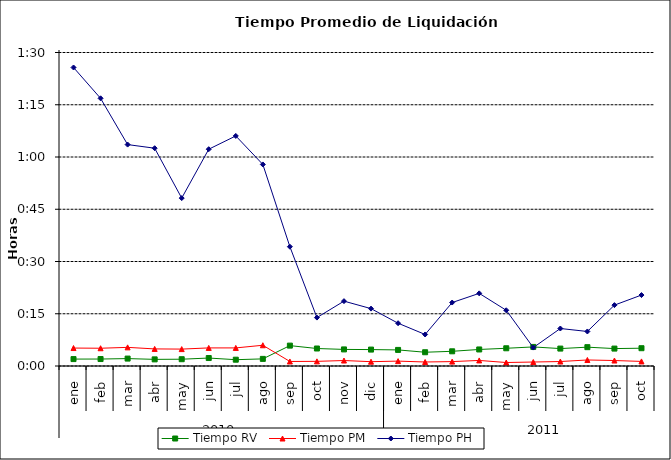
| Category | Tiempo RV | Tiempo PM | Tiempo PH |
|---|---|---|---|
| 0 | 0.001 | 0.004 | 0.06 |
| 1 | 0.001 | 0.004 | 0.053 |
| 2 | 0.001 | 0.004 | 0.044 |
| 3 | 0.001 | 0.003 | 0.043 |
| 4 | 0.001 | 0.003 | 0.033 |
| 5 | 0.002 | 0.004 | 0.043 |
| 6 | 0.001 | 0.004 | 0.046 |
| 7 | 0.001 | 0.004 | 0.04 |
| 8 | 0.004 | 0.001 | 0.024 |
| 9 | 0.003 | 0.001 | 0.01 |
| 10 | 0.003 | 0.001 | 0.013 |
| 11 | 0.003 | 0.001 | 0.011 |
| 12 | 0.003 | 0.001 | 0.009 |
| 13 | 0.003 | 0.001 | 0.006 |
| 14 | 0.003 | 0.001 | 0.013 |
| 15 | 0.003 | 0.001 | 0.014 |
| 16 | 0.004 | 0.001 | 0.011 |
| 17 | 0.004 | 0.001 | 0.004 |
| 18 | 0.003 | 0.001 | 0.007 |
| 19 | 0.004 | 0.001 | 0.007 |
| 20 | 0.003 | 0.001 | 0.012 |
| 21 | 0.004 | 0.001 | 0.014 |